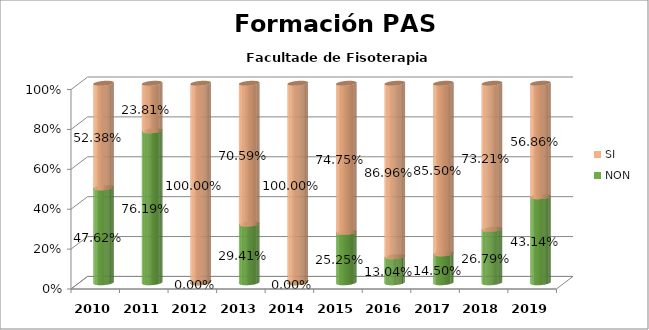
| Category | NON | SI |
|---|---|---|
| 2010.0 | 0.476 | 0.524 |
| 2011.0 | 0.762 | 0.238 |
| 2012.0 | 0 | 1 |
| 2013.0 | 0.294 | 0.706 |
| 2014.0 | 0 | 1 |
| 2015.0 | 0.252 | 0.748 |
| 2016.0 | 0.13 | 0.87 |
| 2017.0 | 0.145 | 0.855 |
| 2018.0 | 0.268 | 0.732 |
| 2019.0 | 0.431 | 0.569 |